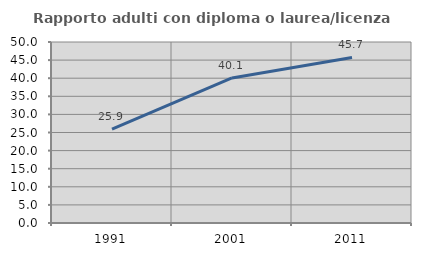
| Category | Rapporto adulti con diploma o laurea/licenza media  |
|---|---|
| 1991.0 | 25.945 |
| 2001.0 | 40.084 |
| 2011.0 | 45.72 |